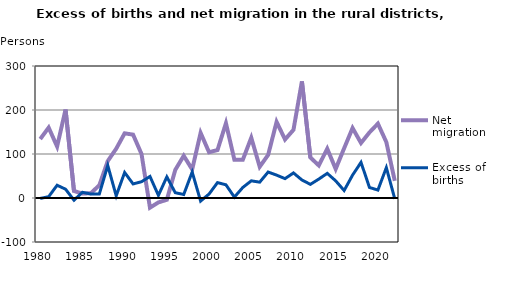
| Category | Net migration | Excess of births |
|---|---|---|
| 1980.0 | 134 | -1 |
| 1981.0 | 160 | 3 |
| 1982.0 | 117 | 29 |
| 1983.0 | 201 | 20 |
| 1984.0 | 16 | -5 |
| 1985.0 | 10 | 13 |
| 1986.0 | 11 | 9 |
| 1987.0 | 29 | 9 |
| 1988.0 | 84 | 74 |
| 1989.0 | 112 | 5 |
| 1990.0 | 147 | 58 |
| 1991.0 | 144 | 32 |
| 1992.0 | 100 | 37 |
| 1993.0 | -22 | 49 |
| 1994.0 | -10 | 6 |
| 1995.0 | -4 | 48 |
| 1996.0 | 64 | 12 |
| 1997.0 | 96 | 8 |
| 1998.0 | 65 | 59 |
| 1999.0 | 148 | -7 |
| 2000.0 | 104 | 9 |
| 2001.0 | 109 | 35 |
| 2002.0 | 170 | 30 |
| 2003.0 | 87 | 2 |
| 2004.0 | 87 | 24 |
| 2005.0 | 137 | 39 |
| 2006.0 | 71 | 36 |
| 2007.0 | 98 | 59 |
| 2008.0 | 173 | 52 |
| 2009.0 | 133 | 44 |
| 2010.0 | 155 | 57 |
| 2011.0 | 265 | 41 |
| 2012.0 | 92 | 31 |
| 2013.0 | 74 | 43 |
| 2014.0 | 112 | 56 |
| 2015.0 | 66 | 39 |
| 2016.0 | 113 | 17 |
| 2017.0 | 159 | 52 |
| 2018.0 | 125 | 81 |
| 2019.0 | 149 | 24 |
| 2020.0 | 169 | 18 |
| 2021.0 | 127 | 69 |
| 2022.0 | 39 | -2 |